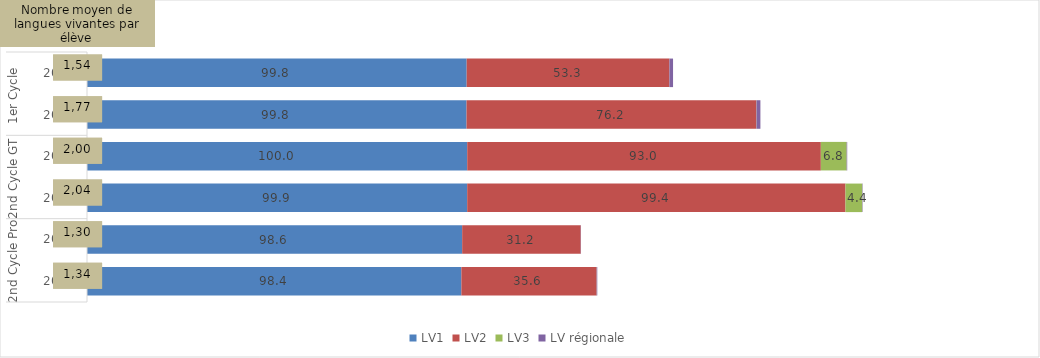
| Category | LV1 | LV2 | LV3 | LV régionale |
|---|---|---|---|---|
| 0 | 99.811 | 53.305 | 0 | 0.945 |
| 1 | 99.77 | 76.188 | 0.037 | 1.03 |
| 2 | 99.951 | 92.961 | 6.79 | 0.144 |
| 3 | 99.944 | 99.441 | 4.414 | 0.103 |
| 4 | 98.626 | 31.17 | 0 | 0.068 |
| 5 | 98.412 | 35.557 | 0.018 | 0.157 |